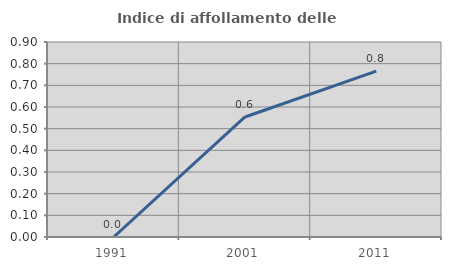
| Category | Indice di affollamento delle abitazioni  |
|---|---|
| 1991.0 | 0 |
| 2001.0 | 0.554 |
| 2011.0 | 0.765 |